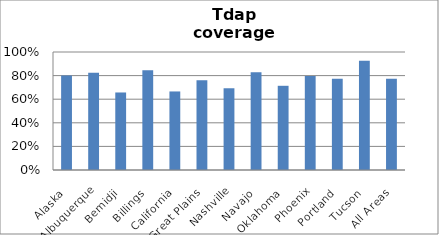
| Category | Tdap |
|---|---|
| Alaska | 0.801 |
| Albuquerque | 0.824 |
| Bemidji | 0.657 |
| Billings | 0.846 |
| California | 0.666 |
| Great Plains | 0.76 |
| Nashville | 0.693 |
| Navajo | 0.829 |
| Oklahoma | 0.714 |
| Phoenix | 0.797 |
| Portland | 0.772 |
| Tucson | 0.926 |
| All Areas | 0.773 |